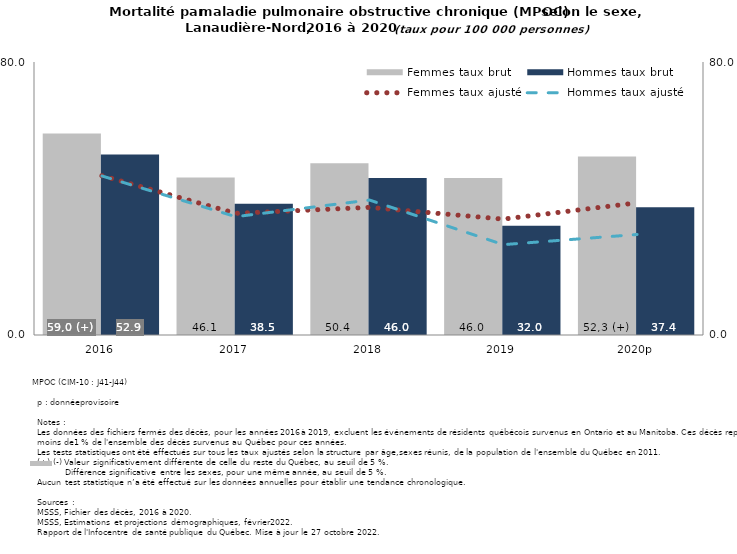
| Category | Femmes taux brut | Hommes taux brut |
|---|---|---|
| 2016 | 59.017 | 52.902 |
| 2017 | 46.143 | 38.488 |
| 2018 | 50.358 | 45.972 |
| 2019 | 46.018 | 32.042 |
| 2020p | 52.274 | 37.448 |